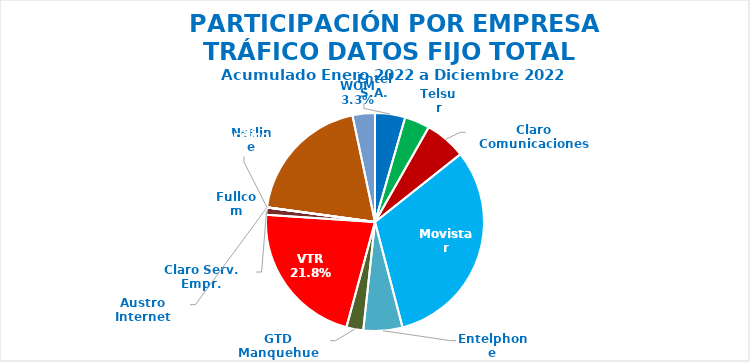
| Category | Series 0 |
|---|---|
| Entel S.A. | 1116729.358 |
| Telsur | 931726.625 |
| Claro Comunicaciones | 1526895.374 |
| Movistar | 7891701.745 |
| Entelphone | 1446738.219 |
| GTD Manquehue | 625425.718 |
| VTR | 5449086.817 |
| Claro Serv. Empr. | 270709.21 |
| Fullcom | 467.001 |
| Netline | 3993.067 |
| Austro Internet | 133.512 |
| Mundo Pacífico | 4876007.162 |
| WOM | 829360.854 |